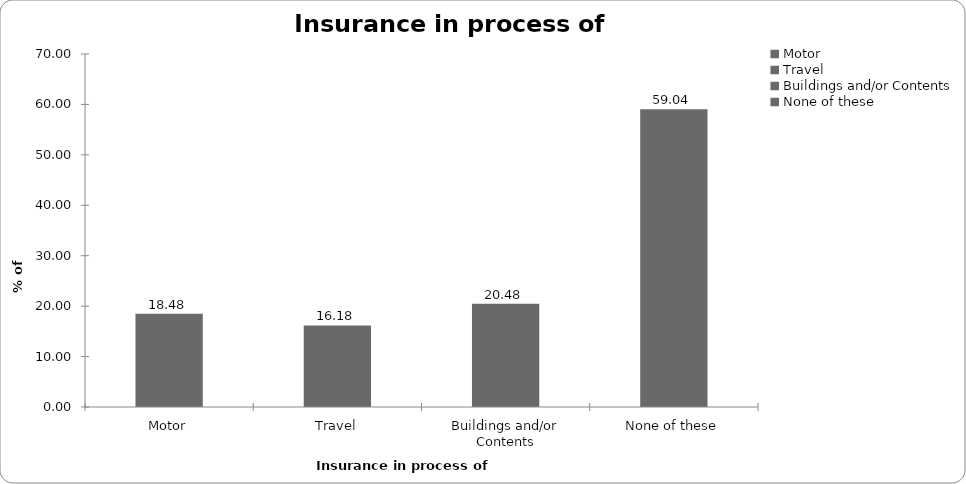
| Category | Insurance in process of buying |
|---|---|
| Motor | 18.482 |
| Travel | 16.184 |
| Buildings and/or Contents | 20.48 |
| None of these | 59.041 |